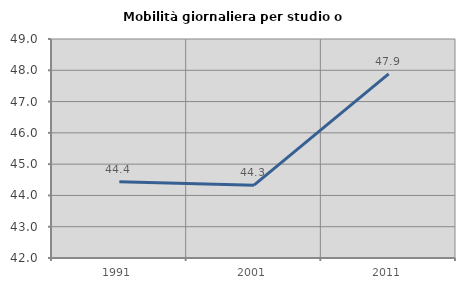
| Category | Mobilità giornaliera per studio o lavoro |
|---|---|
| 1991.0 | 44.436 |
| 2001.0 | 44.328 |
| 2011.0 | 47.883 |